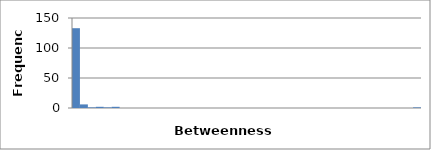
| Category | 133 |
|---|---|
| 0.0 | 133 |
| 281.1316796511628 | 6 |
| 562.2633593023256 | 1 |
| 843.3950389534884 | 2 |
| 1124.5267186046513 | 1 |
| 1405.658398255814 | 2 |
| 1686.7900779069769 | 0 |
| 1967.9217575581397 | 0 |
| 2249.0534372093025 | 0 |
| 2530.1851168604653 | 0 |
| 2811.316796511628 | 0 |
| 3092.448476162791 | 0 |
| 3373.5801558139538 | 0 |
| 3654.7118354651166 | 0 |
| 3935.8435151162794 | 0 |
| 4216.975194767442 | 0 |
| 4498.106874418605 | 0 |
| 4779.238554069768 | 0 |
| 5060.370233720931 | 0 |
| 5341.501913372093 | 0 |
| 5622.633593023256 | 0 |
| 5903.765272674419 | 0 |
| 6184.896952325582 | 0 |
| 6466.028631976745 | 0 |
| 6747.1603116279075 | 0 |
| 7028.29199127907 | 0 |
| 7309.423670930233 | 0 |
| 7590.555350581396 | 0 |
| 7871.687030232559 | 0 |
| 8152.818709883722 | 0 |
| 8433.950389534884 | 0 |
| 8715.082069186046 | 0 |
| 8996.21374883721 | 0 |
| 9277.345428488374 | 0 |
| 9558.477108139537 | 0 |
| 9839.608787790701 | 0 |
| 10120.740467441865 | 0 |
| 10401.872147093029 | 0 |
| 10683.003826744192 | 0 |
| 10964.135506395356 | 0 |
| 11245.26718604652 | 0 |
| 11526.398865697684 | 0 |
| 11807.530545348847 | 0 |
| 12088.662225 | 1 |